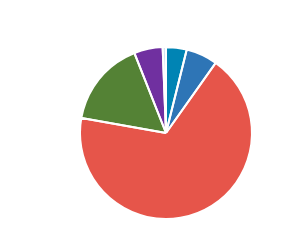
| Category | Series 0 |
|---|---|
| PC | 1373 |
| MC | 2095 |
| CAR | 24041 |
| LGV | 5731 |
| OGV1 | 1897 |
| OGV2 | 197 |
| PSV | 24 |